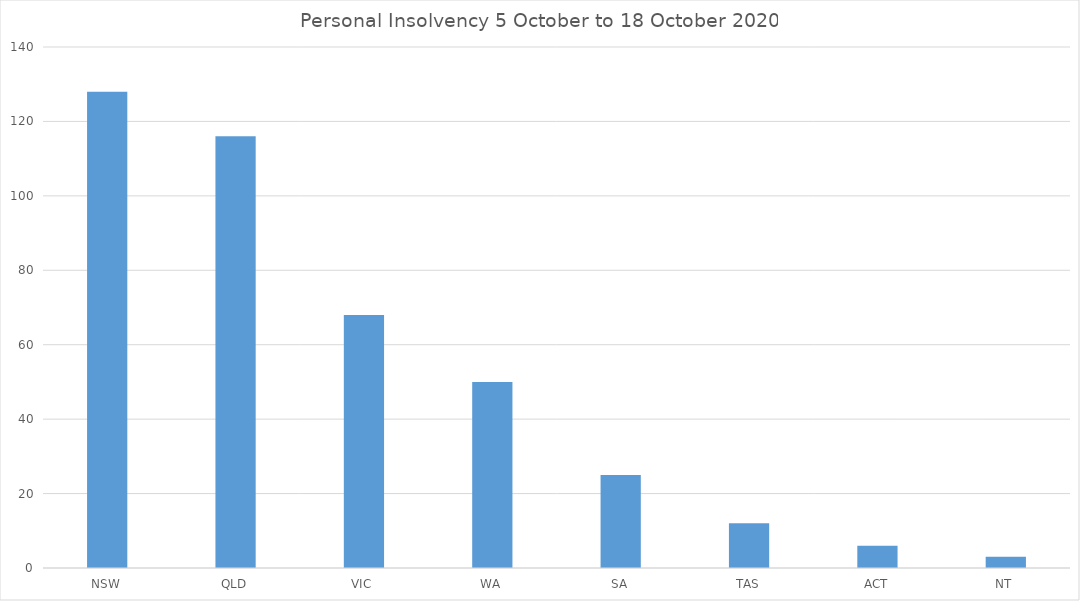
| Category | Personal Insolvency |
|---|---|
| NSW | 128 |
| QLD | 116 |
| VIC | 68 |
| WA | 50 |
| SA | 25 |
| TAS | 12 |
| ACT | 6 |
| NT | 3 |